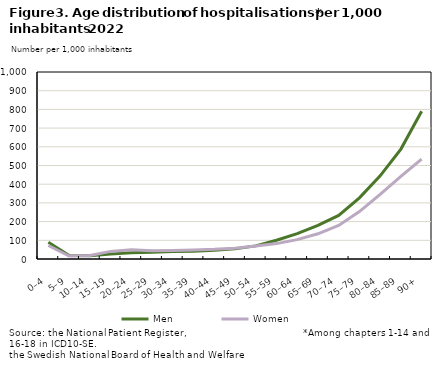
| Category | Men | Women |
|---|---|---|
| 0–4 | 89.905 | 72.023 |
| 5–9 | 18.814 | 16.223 |
| 10–14 | 17.247 | 19.094 |
| 15–19 | 26.591 | 40.659 |
| 20–24 | 33.955 | 50.071 |
| 25–29 | 35.919 | 43.743 |
| 30–34 | 39.943 | 45.94 |
| 35–39 | 41.696 | 48.498 |
| 40–44 | 46.449 | 51.569 |
| 45–49 | 54.168 | 57.342 |
| 50–54 | 70.074 | 69.121 |
| 55–59 | 100.462 | 82.348 |
| 60–64 | 135.533 | 103.471 |
| 65–69 | 179.675 | 134.731 |
| 70–74 | 233.048 | 179.188 |
| 75–79 | 326.918 | 253.765 |
| 80–84 | 444.582 | 345.38 |
| 85–89 | 587.859 | 441.551 |
| 90+ | 790.55 | 533.962 |